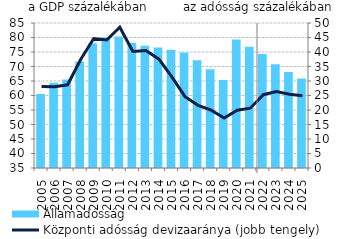
| Category | Államadósság |
|---|---|
| 2005.0 | 60.518 |
| 2006.0 | 64.427 |
| 2007.0 | 65.55 |
| 2008.0 | 71.757 |
| 2009.0 | 78.032 |
| 2010.0 | 80.007 |
| 2011.0 | 80.338 |
| 2012.0 | 78.155 |
| 2013.0 | 77.198 |
| 2014.0 | 76.542 |
| 2015.0 | 75.76 |
| 2016.0 | 74.85 |
| 2017.0 | 72.114 |
| 2018.0 | 69.078 |
| 2019.0 | 65.329 |
| 2020.0 | 79.297 |
| 2021.0 | 76.827 |
| 2022.0 | 74.311 |
| 2023.0 | 70.756 |
| 2024.0 | 68.083 |
| 2025.0 | 65.871 |